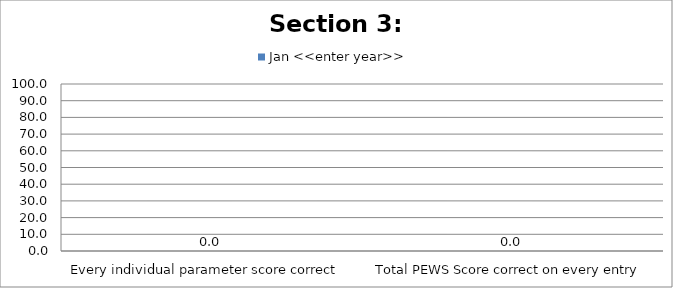
| Category | Jan <<enter year>> |
|---|---|
| Every individual parameter score correct  | 0 |
| Total PEWS Score correct on every entry | 0 |